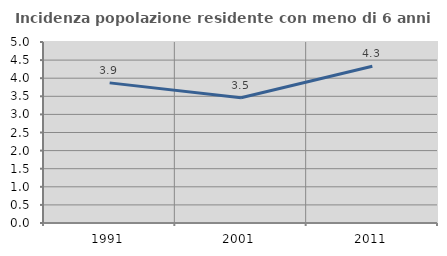
| Category | Incidenza popolazione residente con meno di 6 anni |
|---|---|
| 1991.0 | 3.871 |
| 2001.0 | 3.46 |
| 2011.0 | 4.332 |